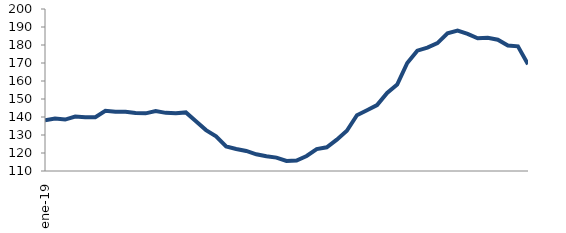
| Category | Series 1 |
|---|---|
| 2019-01-01 | 138.159 |
| 2019-02-01 | 139.126 |
| 2019-03-01 | 138.572 |
| 2019-04-01 | 140.245 |
| 2019-05-01 | 139.837 |
| 2019-06-01 | 139.902 |
| 2019-07-01 | 143.407 |
| 2019-08-01 | 142.858 |
| 2019-09-01 | 142.851 |
| 2019-10-01 | 142.191 |
| 2019-11-01 | 142.033 |
| 2019-12-01 | 143.368 |
| 2020-01-01 | 142.304 |
| 2020-02-01 | 142.083 |
| 2020-03-01 | 142.55 |
| 2020-04-01 | 137.633 |
| 2020-05-01 | 132.724 |
| 2020-06-01 | 129.259 |
| 2020-07-01 | 123.596 |
| 2020-08-01 | 122.255 |
| 2020-09-01 | 121.144 |
| 2020-10-01 | 119.283 |
| 2020-11-01 | 118.161 |
| 2020-12-01 | 117.437 |
| 2021-01-01 | 115.578 |
| 2021-02-01 | 115.815 |
| 2021-03-01 | 118.336 |
| 2021-04-01 | 122.182 |
| 2021-05-01 | 123.161 |
| 2021-06-01 | 127.378 |
| 2021-07-01 | 132.379 |
| 2021-08-01 | 140.968 |
| 2021-09-01 | 143.714 |
| 2021-10-01 | 146.592 |
| 2021-11-01 | 153.358 |
| 2021-12-01 | 158.065 |
| 2022-01-01 | 169.996 |
| 2022-02-01 | 176.833 |
| 2022-03-01 | 178.555 |
| 2022-04-01 | 181.017 |
| 2022-05-01 | 186.486 |
| 2022-06-01 | 187.985 |
| 2022-07-01 | 186.205 |
| 2022-08-01 | 183.725 |
| 2022-09-01 | 184.03 |
| 2022-10-01 | 182.947 |
| 2022-11-01 | 179.704 |
| 2022-12-01 | 179.279 |
| 2023-01-01 | 169.264 |